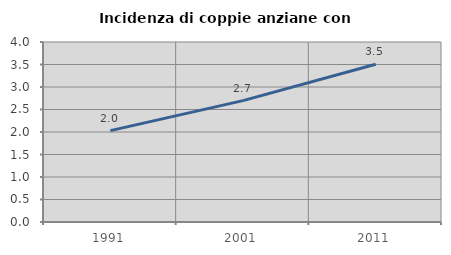
| Category | Incidenza di coppie anziane con figli |
|---|---|
| 1991.0 | 2.03 |
| 2001.0 | 2.697 |
| 2011.0 | 3.505 |